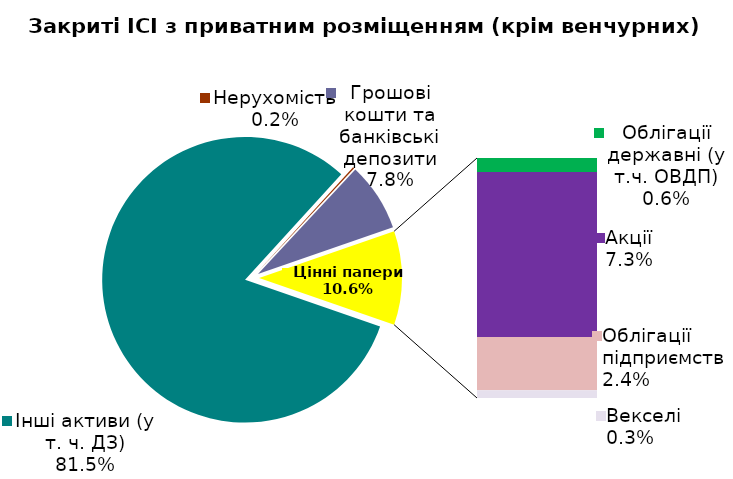
| Category | Series 0 |
|---|---|
| Інші активи (у т. ч. ДЗ) | 0.815 |
| Нерухомість | 0.002 |
| Грошові кошти та банківські депозити | 0.078 |
| Облігації державні (у т.ч. ОВДП) | 0.006 |
| Акції | 0.073 |
| Облігації підприємств | 0.024 |
| Векселі | 0.003 |